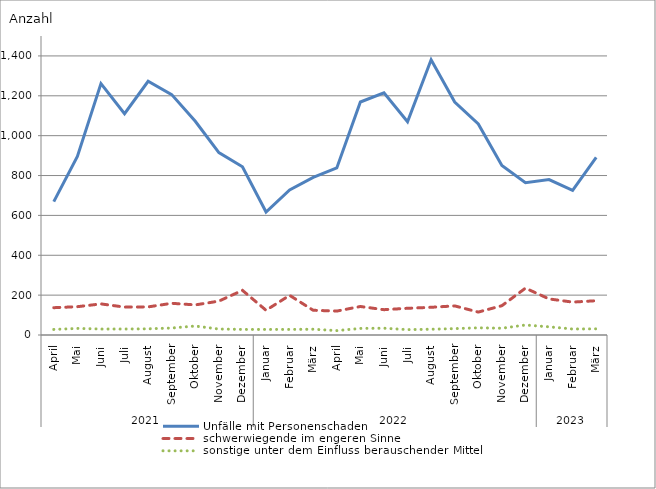
| Category | Unfälle mit Personenschaden | schwerwiegende im engeren Sinne | sonstige unter dem Einfluss berauschender Mittel |
|---|---|---|---|
| 0 | 669 | 137 | 28 |
| 1 | 896 | 142 | 33 |
| 2 | 1261 | 156 | 30 |
| 3 | 1110 | 140 | 30 |
| 4 | 1273 | 141 | 31 |
| 5 | 1206 | 159 | 35 |
| 6 | 1072 | 151 | 45 |
| 7 | 915 | 170 | 30 |
| 8 | 844 | 224 | 28 |
| 9 | 617 | 124 | 28 |
| 10 | 728 | 199 | 28 |
| 11 | 791 | 124 | 29 |
| 12 | 838 | 120 | 22 |
| 13 | 1169 | 143 | 33 |
| 14 | 1215 | 127 | 34 |
| 15 | 1070 | 134 | 27 |
| 16 | 1381 | 139 | 29 |
| 17 | 1169 | 146 | 32 |
| 18 | 1059 | 115 | 36 |
| 19 | 850 | 147 | 34 |
| 20 | 764 | 235 | 50 |
| 21 | 780 | 181 | 41 |
| 22 | 725 | 165 | 30 |
| 23 | 891 | 172 | 31 |